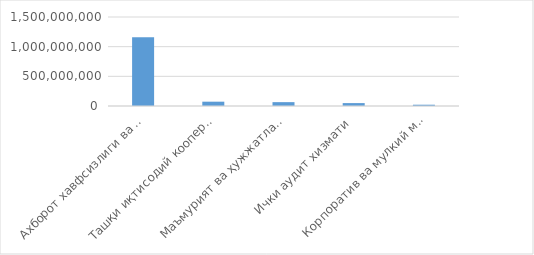
| Category | Товар / хизматнинг
жами суммаси
(cумда) 
(ҚҚС билан) |
|---|---|
| Ахборот хавфсизлиги ва ахборот технологияларини ривожлантириш бошқармаси | 1159300000 |
| Ташқи иқтисодий кооперация, инвестиция ва инновация департаменти | 72800000 |
| Маъмурият ва ҳужжатлар ижроси назорати бошқармаси | 65000000 |
| Ички аудит хизмати | 49000000 |
| Корпоратив ва мулкий муносабатлар бошқармаси | 21600000 |